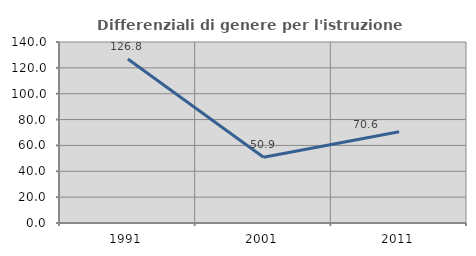
| Category | Differenziali di genere per l'istruzione superiore |
|---|---|
| 1991.0 | 126.838 |
| 2001.0 | 50.865 |
| 2011.0 | 70.588 |